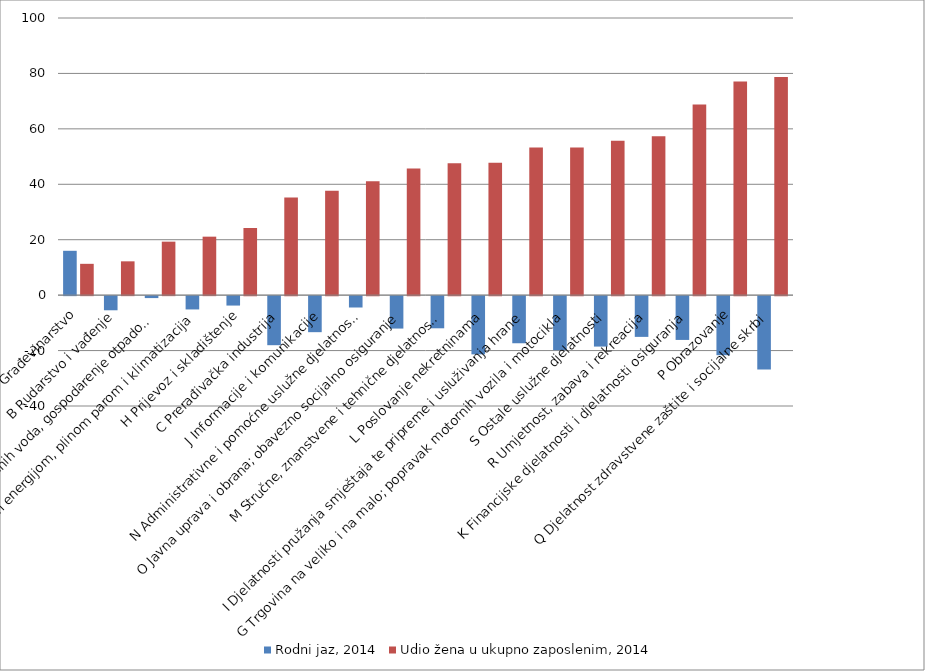
| Category | Rodni jaz, 2014 | Udio žena u ukupno zaposlenim, 2014 |
|---|---|---|
| F Građevinarstvo | 16 | 11.3 |
| B Rudarstvo i vađenje | -5.1 | 12.2 |
| E Opskrba vodom; uklanjanje otpadnih voda, gospodarenje otpadom te djelatnosti sanacije okoliša | -0.7 | 19.3 |
| D Opskrba električnom energijom, plinom parom i klimatizacija | -4.8 | 21.1 |
| H Prijevoz i skladištenje | -3.4 | 24.2 |
| C Prerađivačka industrija | -17.7 | 35.2 |
| J Informacije i komunikacije | -13 | 37.7 |
| N Administrativne i pomoćne uslužne djelatnosti | -4.1 | 41.1 |
| O Javna uprava i obrana; obavezno socijalno osiguranje | -11.7 | 45.7 |
| M Stručne, znanstvene i tehnične djelatnosti | -11.6 | 47.6 |
| L Poslovanje nekretninama | -21 | 47.8 |
| I Djelatnosti pružanja smještaja te pripreme i usluživanja hrane | -17 | 53.3 |
| G Trgovina na veliko i na malo; popravak motornih vozila i motocikla | -19.5 | 53.3 |
| S Ostale uslužne djelatnosti | -18.2 | 55.7 |
| R Umjetnost, zabava i rekreacija | -14.7 | 57.3 |
| K Financijske djelatnosti i djelatnosti osiguranja | -15.8 | 68.8 |
| P Obrazovanje | -21.3 | 77.1 |
| Q Djelatnost zdravstvene zaštite i socijalne skrbi | -26.5 | 78.7 |